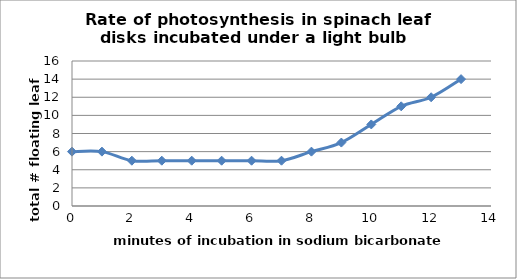
| Category | Series 0 |
|---|---|
| 0.0 | 6 |
| 1.0 | 6 |
| 2.0 | 5 |
| 3.0 | 5 |
| 4.0 | 5 |
| 5.0 | 5 |
| 6.0 | 5 |
| 7.0 | 5 |
| 8.0 | 6 |
| 9.0 | 7 |
| 10.0 | 9 |
| 11.0 | 11 |
| 12.0 | 12 |
| 13.0 | 14 |